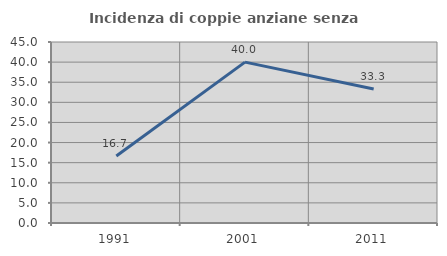
| Category | Incidenza di coppie anziane senza figli  |
|---|---|
| 1991.0 | 16.667 |
| 2001.0 | 40 |
| 2011.0 | 33.333 |